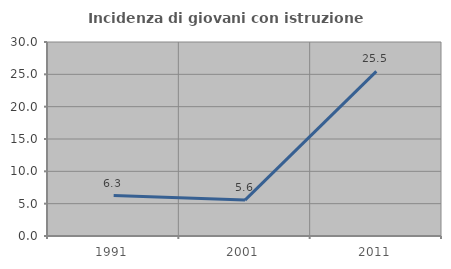
| Category | Incidenza di giovani con istruzione universitaria |
|---|---|
| 1991.0 | 6.25 |
| 2001.0 | 5.556 |
| 2011.0 | 25.455 |